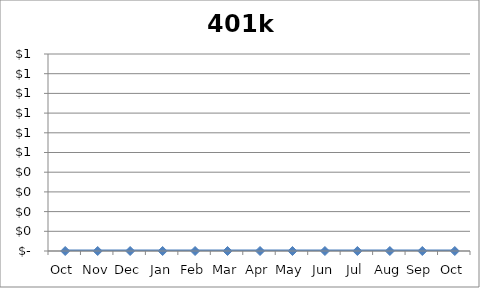
| Category | 401k |
|---|---|
| Oct | 0 |
| Nov | 0 |
| Dec | 0 |
| Jan | 0 |
| Feb | 0 |
| Mar | 0 |
| Apr | 0 |
| May | 0 |
| Jun | 0 |
| Jul | 0 |
| Aug | 0 |
| Sep | 0 |
| Oct | 0 |